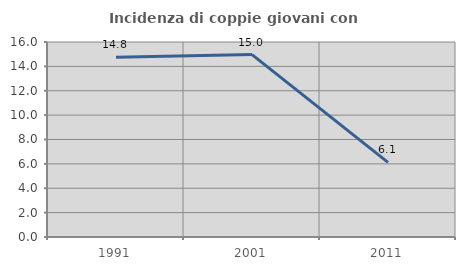
| Category | Incidenza di coppie giovani con figli |
|---|---|
| 1991.0 | 14.754 |
| 2001.0 | 14.97 |
| 2011.0 | 6.122 |